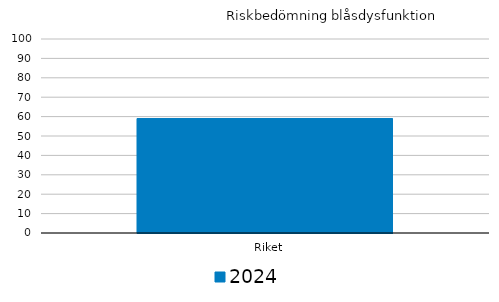
| Category | 2024 |
|---|---|
|   Riket | 59 |